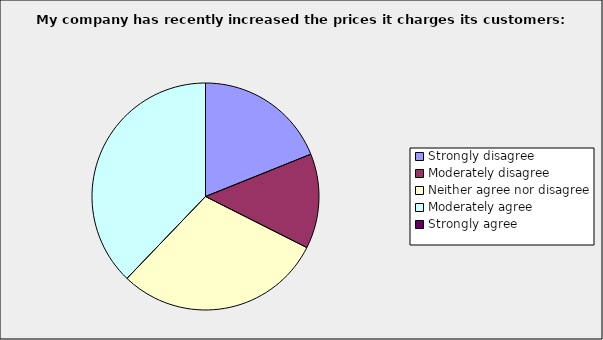
| Category | Series 0 |
|---|---|
| Strongly disagree | 0.189 |
| Moderately disagree | 0.135 |
| Neither agree nor disagree | 0.297 |
| Moderately agree | 0.378 |
| Strongly agree | 0 |